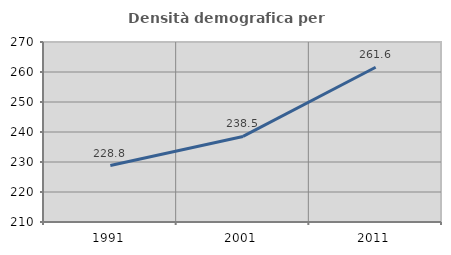
| Category | Densità demografica |
|---|---|
| 1991.0 | 228.833 |
| 2001.0 | 238.53 |
| 2011.0 | 261.577 |